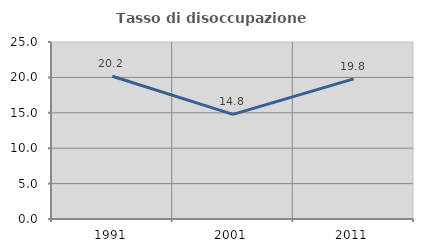
| Category | Tasso di disoccupazione giovanile  |
|---|---|
| 1991.0 | 20.168 |
| 2001.0 | 14.778 |
| 2011.0 | 19.792 |